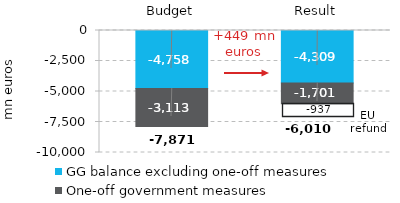
| Category | GG balance excluding one-off measures | One-off government measures |
|---|---|---|
| Budget | -4758.196 | -3113 |
| Result | -4309.035 | -1700.778 |